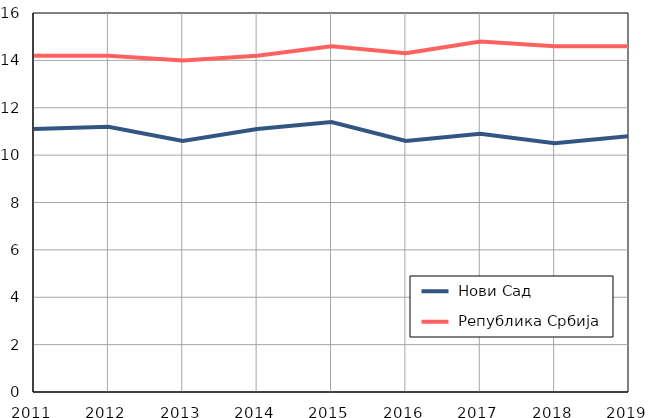
| Category |  Нови Сад |  Република Србија |
|---|---|---|
| 2011.0 | 11.1 | 14.2 |
| 2012.0 | 11.2 | 14.2 |
| 2013.0 | 10.6 | 14 |
| 2014.0 | 11.1 | 14.2 |
| 2015.0 | 11.4 | 14.6 |
| 2016.0 | 10.6 | 14.3 |
| 2017.0 | 10.9 | 14.8 |
| 2018.0 | 10.5 | 14.6 |
| 2019.0 | 10.8 | 14.6 |